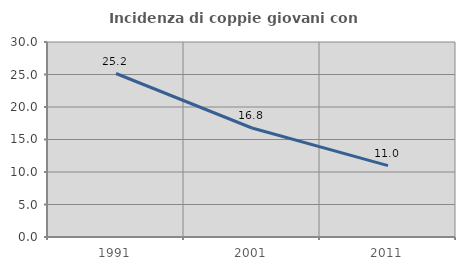
| Category | Incidenza di coppie giovani con figli |
|---|---|
| 1991.0 | 25.153 |
| 2001.0 | 16.77 |
| 2011.0 | 10.976 |